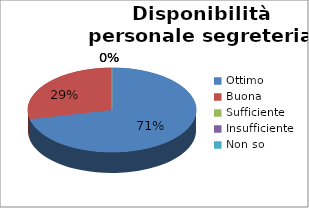
| Category | Disponibilità personale segreteria |
|---|---|
| Ottimo | 15 |
| Buona | 6 |
| Sufficiente | 0 |
| Insufficiente | 0 |
| Non so | 0 |